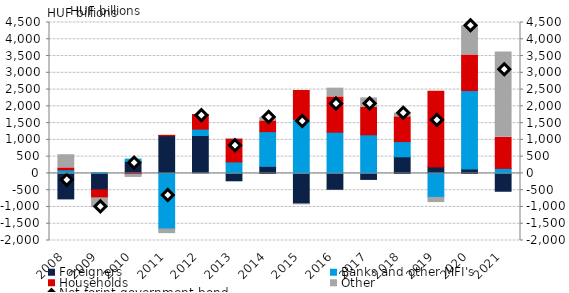
| Category | Foreigners | Banks and other MFI's | Households | Other |
|---|---|---|---|---|
| 2008.0 | -759.65 | 107.753 | 57.047 | 392.2 |
| 2009.0 | -491.4 | 23.556 | -236.156 | -293.241 |
| 2010.0 | 358.869 | 68.381 | -32.221 | -87.487 |
| 2011.0 | 1124.084 | -1656.51 | 11.985 | -139.476 |
| 2012.0 | 1130.805 | 189.835 | 433.858 | -29.175 |
| 2013.0 | -219.704 | 342.911 | 675.773 | 24.837 |
| 2014.0 | 209.723 | 1035.767 | 320.976 | 103.968 |
| 2015.0 | -901.505 | 1614.165 | 857.987 | -21.991 |
| 2016.0 | -472.926 | 1229.477 | 1051.766 | 261.126 |
| 2017.0 | -178.442 | 1151.054 | 813.833 | 286.152 |
| 2018.0 | 495.598 | 454.326 | 738.809 | 106.89 |
| 2019.0 | 191.648 | -715.225 | 2258.289 | -154.593 |
| 2020.0 | 130.571 | 2340.032 | 1061.422 | 872.127 |
| 2021.0 | -531.78 | 150.168 | 927.345 | 2545.472 |